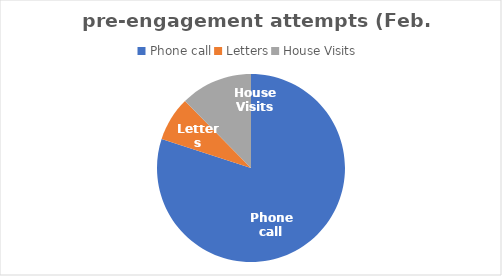
| Category | Series 0 |
|---|---|
| Phone call | 84 |
| Letters | 8 |
| House Visits | 13 |